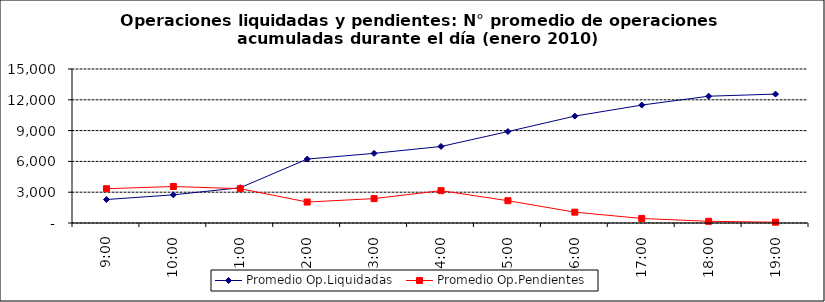
| Category | Promedio Op.Liquidadas | Promedio Op.Pendientes |
|---|---|---|
| 0.375 | 2286.75 | 3339.3 |
| 0.4166666666666667 | 2744.8 | 3554.15 |
| 0.4583333333333333 | 3435.4 | 3342.35 |
| 0.5 | 6224.95 | 2040.2 |
| 0.5416666666666666 | 6783.85 | 2376.6 |
| 0.5833333333333334 | 7451.45 | 3152.4 |
| 0.625 | 8906.15 | 2171.55 |
| 0.6666666666666666 | 10412.25 | 1055.8 |
| 0.7083333333333334 | 11487 | 442.65 |
| 0.75 | 12348.9 | 165.75 |
| 0.7916666666666666 | 12557.15 | 77.55 |